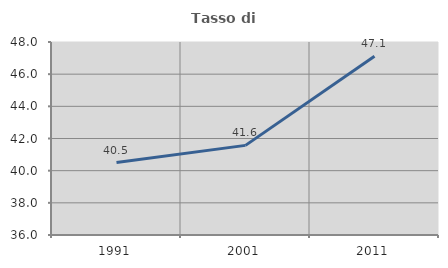
| Category | Tasso di occupazione   |
|---|---|
| 1991.0 | 40.506 |
| 2001.0 | 41.573 |
| 2011.0 | 47.115 |